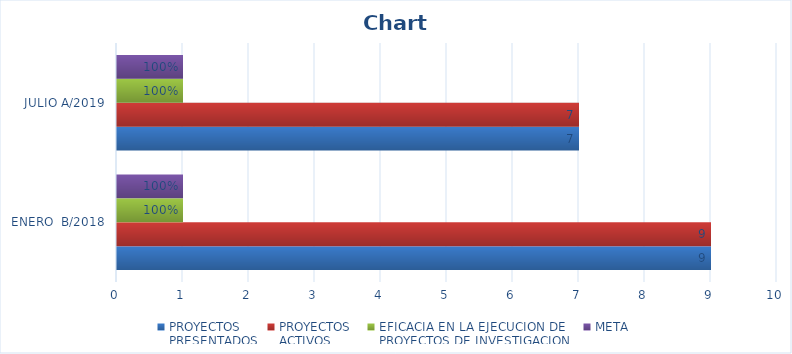
| Category | PROYECTOS
PRESENTADOS | PROYECTOS
ACTIVOS | EFICACIA EN LA EJECUCION DE 
PROYECTOS DE INVESTIGACION | META |
|---|---|---|---|---|
| ENERO  B/2018 | 9 | 9 | 1 | 1 |
| JULIO A/2019 | 7 | 7 | 1 | 1 |